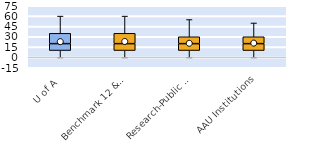
| Category | 25th | 50th | 75th |
|---|---|---|---|
| U of A | 10 | 10 | 15 |
| Benchmark 12 & SEC | 10 | 10 | 15 |
| Research-Public Univ | 10 | 10 | 10 |
| AAU Institutions | 10 | 10 | 10 |